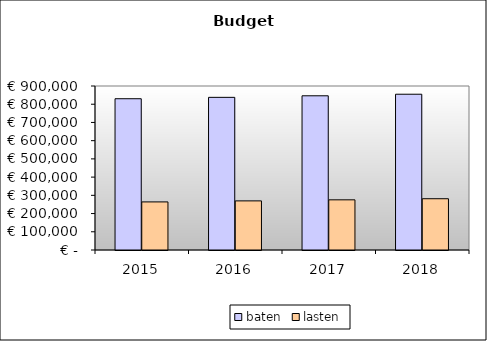
| Category | baten | lasten |
|---|---|---|
| 2015.0 | 830126.495 | 263904.48 |
| 2016.0 | 837694.403 | 269506.44 |
| 2017.0 | 846257.443 | 275310.9 |
| 2018.0 | 854820.483 | 281337.3 |